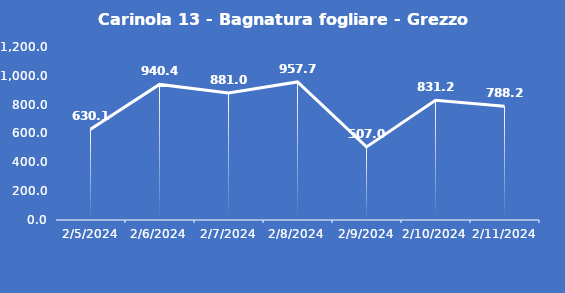
| Category | Carinola 13 - Bagnatura fogliare - Grezzo (min) |
|---|---|
| 2/5/24 | 630.1 |
| 2/6/24 | 940.4 |
| 2/7/24 | 881 |
| 2/8/24 | 957.7 |
| 2/9/24 | 507 |
| 2/10/24 | 831.2 |
| 2/11/24 | 788.2 |